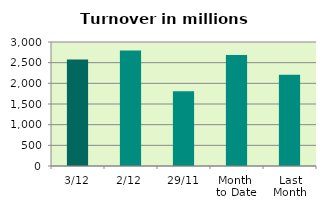
| Category | Series 0 |
|---|---|
| 3/12 | 2573.994 |
| 2/12 | 2791.388 |
| 29/11 | 1809.007 |
| Month 
to Date | 2682.691 |
| Last
Month | 2210.602 |